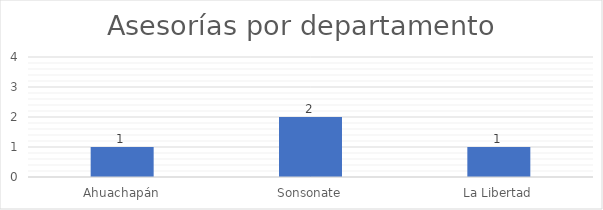
| Category | Series 0 |
|---|---|
| Ahuachapán | 1 |
| Sonsonate | 2 |
| La Libertad | 1 |